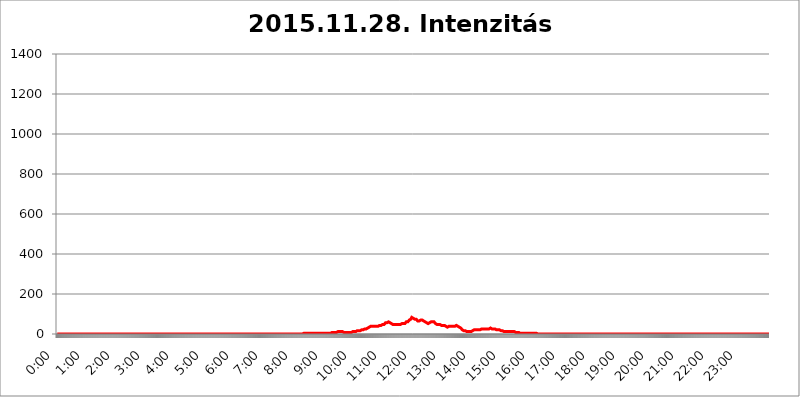
| Category | 2015.11.28. Intenzitás [W/m^2] |
|---|---|
| 0.0 | 0 |
| 0.0006944444444444445 | 0 |
| 0.001388888888888889 | 0 |
| 0.0020833333333333333 | 0 |
| 0.002777777777777778 | 0 |
| 0.003472222222222222 | 0 |
| 0.004166666666666667 | 0 |
| 0.004861111111111111 | 0 |
| 0.005555555555555556 | 0 |
| 0.0062499999999999995 | 0 |
| 0.006944444444444444 | 0 |
| 0.007638888888888889 | 0 |
| 0.008333333333333333 | 0 |
| 0.009027777777777779 | 0 |
| 0.009722222222222222 | 0 |
| 0.010416666666666666 | 0 |
| 0.011111111111111112 | 0 |
| 0.011805555555555555 | 0 |
| 0.012499999999999999 | 0 |
| 0.013194444444444444 | 0 |
| 0.013888888888888888 | 0 |
| 0.014583333333333332 | 0 |
| 0.015277777777777777 | 0 |
| 0.015972222222222224 | 0 |
| 0.016666666666666666 | 0 |
| 0.017361111111111112 | 0 |
| 0.018055555555555557 | 0 |
| 0.01875 | 0 |
| 0.019444444444444445 | 0 |
| 0.02013888888888889 | 0 |
| 0.020833333333333332 | 0 |
| 0.02152777777777778 | 0 |
| 0.022222222222222223 | 0 |
| 0.02291666666666667 | 0 |
| 0.02361111111111111 | 0 |
| 0.024305555555555556 | 0 |
| 0.024999999999999998 | 0 |
| 0.025694444444444447 | 0 |
| 0.02638888888888889 | 0 |
| 0.027083333333333334 | 0 |
| 0.027777777777777776 | 0 |
| 0.02847222222222222 | 0 |
| 0.029166666666666664 | 0 |
| 0.029861111111111113 | 0 |
| 0.030555555555555555 | 0 |
| 0.03125 | 0 |
| 0.03194444444444445 | 0 |
| 0.03263888888888889 | 0 |
| 0.03333333333333333 | 0 |
| 0.034027777777777775 | 0 |
| 0.034722222222222224 | 0 |
| 0.035416666666666666 | 0 |
| 0.036111111111111115 | 0 |
| 0.03680555555555556 | 0 |
| 0.0375 | 0 |
| 0.03819444444444444 | 0 |
| 0.03888888888888889 | 0 |
| 0.03958333333333333 | 0 |
| 0.04027777777777778 | 0 |
| 0.04097222222222222 | 0 |
| 0.041666666666666664 | 0 |
| 0.042361111111111106 | 0 |
| 0.04305555555555556 | 0 |
| 0.043750000000000004 | 0 |
| 0.044444444444444446 | 0 |
| 0.04513888888888889 | 0 |
| 0.04583333333333334 | 0 |
| 0.04652777777777778 | 0 |
| 0.04722222222222222 | 0 |
| 0.04791666666666666 | 0 |
| 0.04861111111111111 | 0 |
| 0.049305555555555554 | 0 |
| 0.049999999999999996 | 0 |
| 0.05069444444444445 | 0 |
| 0.051388888888888894 | 0 |
| 0.052083333333333336 | 0 |
| 0.05277777777777778 | 0 |
| 0.05347222222222222 | 0 |
| 0.05416666666666667 | 0 |
| 0.05486111111111111 | 0 |
| 0.05555555555555555 | 0 |
| 0.05625 | 0 |
| 0.05694444444444444 | 0 |
| 0.057638888888888885 | 0 |
| 0.05833333333333333 | 0 |
| 0.05902777777777778 | 0 |
| 0.059722222222222225 | 0 |
| 0.06041666666666667 | 0 |
| 0.061111111111111116 | 0 |
| 0.06180555555555556 | 0 |
| 0.0625 | 0 |
| 0.06319444444444444 | 0 |
| 0.06388888888888888 | 0 |
| 0.06458333333333334 | 0 |
| 0.06527777777777778 | 0 |
| 0.06597222222222222 | 0 |
| 0.06666666666666667 | 0 |
| 0.06736111111111111 | 0 |
| 0.06805555555555555 | 0 |
| 0.06874999999999999 | 0 |
| 0.06944444444444443 | 0 |
| 0.07013888888888889 | 0 |
| 0.07083333333333333 | 0 |
| 0.07152777777777779 | 0 |
| 0.07222222222222223 | 0 |
| 0.07291666666666667 | 0 |
| 0.07361111111111111 | 0 |
| 0.07430555555555556 | 0 |
| 0.075 | 0 |
| 0.07569444444444444 | 0 |
| 0.0763888888888889 | 0 |
| 0.07708333333333334 | 0 |
| 0.07777777777777778 | 0 |
| 0.07847222222222222 | 0 |
| 0.07916666666666666 | 0 |
| 0.0798611111111111 | 0 |
| 0.08055555555555556 | 0 |
| 0.08125 | 0 |
| 0.08194444444444444 | 0 |
| 0.08263888888888889 | 0 |
| 0.08333333333333333 | 0 |
| 0.08402777777777777 | 0 |
| 0.08472222222222221 | 0 |
| 0.08541666666666665 | 0 |
| 0.08611111111111112 | 0 |
| 0.08680555555555557 | 0 |
| 0.08750000000000001 | 0 |
| 0.08819444444444445 | 0 |
| 0.08888888888888889 | 0 |
| 0.08958333333333333 | 0 |
| 0.09027777777777778 | 0 |
| 0.09097222222222222 | 0 |
| 0.09166666666666667 | 0 |
| 0.09236111111111112 | 0 |
| 0.09305555555555556 | 0 |
| 0.09375 | 0 |
| 0.09444444444444444 | 0 |
| 0.09513888888888888 | 0 |
| 0.09583333333333333 | 0 |
| 0.09652777777777777 | 0 |
| 0.09722222222222222 | 0 |
| 0.09791666666666667 | 0 |
| 0.09861111111111111 | 0 |
| 0.09930555555555555 | 0 |
| 0.09999999999999999 | 0 |
| 0.10069444444444443 | 0 |
| 0.1013888888888889 | 0 |
| 0.10208333333333335 | 0 |
| 0.10277777777777779 | 0 |
| 0.10347222222222223 | 0 |
| 0.10416666666666667 | 0 |
| 0.10486111111111111 | 0 |
| 0.10555555555555556 | 0 |
| 0.10625 | 0 |
| 0.10694444444444444 | 0 |
| 0.1076388888888889 | 0 |
| 0.10833333333333334 | 0 |
| 0.10902777777777778 | 0 |
| 0.10972222222222222 | 0 |
| 0.1111111111111111 | 0 |
| 0.11180555555555556 | 0 |
| 0.11180555555555556 | 0 |
| 0.1125 | 0 |
| 0.11319444444444444 | 0 |
| 0.11388888888888889 | 0 |
| 0.11458333333333333 | 0 |
| 0.11527777777777777 | 0 |
| 0.11597222222222221 | 0 |
| 0.11666666666666665 | 0 |
| 0.1173611111111111 | 0 |
| 0.11805555555555557 | 0 |
| 0.11944444444444445 | 0 |
| 0.12013888888888889 | 0 |
| 0.12083333333333333 | 0 |
| 0.12152777777777778 | 0 |
| 0.12222222222222223 | 0 |
| 0.12291666666666667 | 0 |
| 0.12291666666666667 | 0 |
| 0.12361111111111112 | 0 |
| 0.12430555555555556 | 0 |
| 0.125 | 0 |
| 0.12569444444444444 | 0 |
| 0.12638888888888888 | 0 |
| 0.12708333333333333 | 0 |
| 0.16875 | 0 |
| 0.12847222222222224 | 0 |
| 0.12916666666666668 | 0 |
| 0.12986111111111112 | 0 |
| 0.13055555555555556 | 0 |
| 0.13125 | 0 |
| 0.13194444444444445 | 0 |
| 0.1326388888888889 | 0 |
| 0.13333333333333333 | 0 |
| 0.13402777777777777 | 0 |
| 0.13402777777777777 | 0 |
| 0.13472222222222222 | 0 |
| 0.13541666666666666 | 0 |
| 0.1361111111111111 | 0 |
| 0.13749999999999998 | 0 |
| 0.13819444444444443 | 0 |
| 0.1388888888888889 | 0 |
| 0.13958333333333334 | 0 |
| 0.14027777777777778 | 0 |
| 0.14097222222222222 | 0 |
| 0.14166666666666666 | 0 |
| 0.1423611111111111 | 0 |
| 0.14305555555555557 | 0 |
| 0.14375000000000002 | 0 |
| 0.14444444444444446 | 0 |
| 0.1451388888888889 | 0 |
| 0.1451388888888889 | 0 |
| 0.14652777777777778 | 0 |
| 0.14722222222222223 | 0 |
| 0.14791666666666667 | 0 |
| 0.1486111111111111 | 0 |
| 0.14930555555555555 | 0 |
| 0.15 | 0 |
| 0.15069444444444444 | 0 |
| 0.15138888888888888 | 0 |
| 0.15208333333333332 | 0 |
| 0.15277777777777776 | 0 |
| 0.15347222222222223 | 0 |
| 0.15416666666666667 | 0 |
| 0.15486111111111112 | 0 |
| 0.15555555555555556 | 0 |
| 0.15625 | 0 |
| 0.15694444444444444 | 0 |
| 0.15763888888888888 | 0 |
| 0.15833333333333333 | 0 |
| 0.15902777777777777 | 0 |
| 0.15972222222222224 | 0 |
| 0.16041666666666668 | 0 |
| 0.16111111111111112 | 0 |
| 0.16180555555555556 | 0 |
| 0.1625 | 0 |
| 0.16319444444444445 | 0 |
| 0.1638888888888889 | 0 |
| 0.16458333333333333 | 0 |
| 0.16527777777777777 | 0 |
| 0.16597222222222222 | 0 |
| 0.16666666666666666 | 0 |
| 0.1673611111111111 | 0 |
| 0.16805555555555554 | 0 |
| 0.16874999999999998 | 0 |
| 0.16944444444444443 | 0 |
| 0.17013888888888887 | 0 |
| 0.1708333333333333 | 0 |
| 0.17152777777777775 | 0 |
| 0.17222222222222225 | 0 |
| 0.1729166666666667 | 0 |
| 0.17361111111111113 | 0 |
| 0.17430555555555557 | 0 |
| 0.17500000000000002 | 0 |
| 0.17569444444444446 | 0 |
| 0.1763888888888889 | 0 |
| 0.17708333333333334 | 0 |
| 0.17777777777777778 | 0 |
| 0.17847222222222223 | 0 |
| 0.17916666666666667 | 0 |
| 0.1798611111111111 | 0 |
| 0.18055555555555555 | 0 |
| 0.18125 | 0 |
| 0.18194444444444444 | 0 |
| 0.1826388888888889 | 0 |
| 0.18333333333333335 | 0 |
| 0.1840277777777778 | 0 |
| 0.18472222222222223 | 0 |
| 0.18541666666666667 | 0 |
| 0.18611111111111112 | 0 |
| 0.18680555555555556 | 0 |
| 0.1875 | 0 |
| 0.18819444444444444 | 0 |
| 0.18888888888888888 | 0 |
| 0.18958333333333333 | 0 |
| 0.19027777777777777 | 0 |
| 0.1909722222222222 | 0 |
| 0.19166666666666665 | 0 |
| 0.19236111111111112 | 0 |
| 0.19305555555555554 | 0 |
| 0.19375 | 0 |
| 0.19444444444444445 | 0 |
| 0.1951388888888889 | 0 |
| 0.19583333333333333 | 0 |
| 0.19652777777777777 | 0 |
| 0.19722222222222222 | 0 |
| 0.19791666666666666 | 0 |
| 0.1986111111111111 | 0 |
| 0.19930555555555554 | 0 |
| 0.19999999999999998 | 0 |
| 0.20069444444444443 | 0 |
| 0.20138888888888887 | 0 |
| 0.2020833333333333 | 0 |
| 0.2027777777777778 | 0 |
| 0.2034722222222222 | 0 |
| 0.2041666666666667 | 0 |
| 0.20486111111111113 | 0 |
| 0.20555555555555557 | 0 |
| 0.20625000000000002 | 0 |
| 0.20694444444444446 | 0 |
| 0.2076388888888889 | 0 |
| 0.20833333333333334 | 0 |
| 0.20902777777777778 | 0 |
| 0.20972222222222223 | 0 |
| 0.21041666666666667 | 0 |
| 0.2111111111111111 | 0 |
| 0.21180555555555555 | 0 |
| 0.2125 | 0 |
| 0.21319444444444444 | 0 |
| 0.2138888888888889 | 0 |
| 0.21458333333333335 | 0 |
| 0.2152777777777778 | 0 |
| 0.21597222222222223 | 0 |
| 0.21666666666666667 | 0 |
| 0.21736111111111112 | 0 |
| 0.21805555555555556 | 0 |
| 0.21875 | 0 |
| 0.21944444444444444 | 0 |
| 0.22013888888888888 | 0 |
| 0.22083333333333333 | 0 |
| 0.22152777777777777 | 0 |
| 0.2222222222222222 | 0 |
| 0.22291666666666665 | 0 |
| 0.2236111111111111 | 0 |
| 0.22430555555555556 | 0 |
| 0.225 | 0 |
| 0.22569444444444445 | 0 |
| 0.2263888888888889 | 0 |
| 0.22708333333333333 | 0 |
| 0.22777777777777777 | 0 |
| 0.22847222222222222 | 0 |
| 0.22916666666666666 | 0 |
| 0.2298611111111111 | 0 |
| 0.23055555555555554 | 0 |
| 0.23124999999999998 | 0 |
| 0.23194444444444443 | 0 |
| 0.23263888888888887 | 0 |
| 0.2333333333333333 | 0 |
| 0.2340277777777778 | 0 |
| 0.2347222222222222 | 0 |
| 0.2354166666666667 | 0 |
| 0.23611111111111113 | 0 |
| 0.23680555555555557 | 0 |
| 0.23750000000000002 | 0 |
| 0.23819444444444446 | 0 |
| 0.2388888888888889 | 0 |
| 0.23958333333333334 | 0 |
| 0.24027777777777778 | 0 |
| 0.24097222222222223 | 0 |
| 0.24166666666666667 | 0 |
| 0.2423611111111111 | 0 |
| 0.24305555555555555 | 0 |
| 0.24375 | 0 |
| 0.24444444444444446 | 0 |
| 0.24513888888888888 | 0 |
| 0.24583333333333335 | 0 |
| 0.2465277777777778 | 0 |
| 0.24722222222222223 | 0 |
| 0.24791666666666667 | 0 |
| 0.24861111111111112 | 0 |
| 0.24930555555555556 | 0 |
| 0.25 | 0 |
| 0.25069444444444444 | 0 |
| 0.2513888888888889 | 0 |
| 0.2520833333333333 | 0 |
| 0.25277777777777777 | 0 |
| 0.2534722222222222 | 0 |
| 0.25416666666666665 | 0 |
| 0.2548611111111111 | 0 |
| 0.2555555555555556 | 0 |
| 0.25625000000000003 | 0 |
| 0.2569444444444445 | 0 |
| 0.2576388888888889 | 0 |
| 0.25833333333333336 | 0 |
| 0.2590277777777778 | 0 |
| 0.25972222222222224 | 0 |
| 0.2604166666666667 | 0 |
| 0.2611111111111111 | 0 |
| 0.26180555555555557 | 0 |
| 0.2625 | 0 |
| 0.26319444444444445 | 0 |
| 0.2638888888888889 | 0 |
| 0.26458333333333334 | 0 |
| 0.2652777777777778 | 0 |
| 0.2659722222222222 | 0 |
| 0.26666666666666666 | 0 |
| 0.2673611111111111 | 0 |
| 0.26805555555555555 | 0 |
| 0.26875 | 0 |
| 0.26944444444444443 | 0 |
| 0.2701388888888889 | 0 |
| 0.2708333333333333 | 0 |
| 0.27152777777777776 | 0 |
| 0.2722222222222222 | 0 |
| 0.27291666666666664 | 0 |
| 0.2736111111111111 | 0 |
| 0.2743055555555555 | 0 |
| 0.27499999999999997 | 0 |
| 0.27569444444444446 | 0 |
| 0.27638888888888885 | 0 |
| 0.27708333333333335 | 0 |
| 0.2777777777777778 | 0 |
| 0.27847222222222223 | 0 |
| 0.2791666666666667 | 0 |
| 0.2798611111111111 | 0 |
| 0.28055555555555556 | 0 |
| 0.28125 | 0 |
| 0.28194444444444444 | 0 |
| 0.2826388888888889 | 0 |
| 0.2833333333333333 | 0 |
| 0.28402777777777777 | 0 |
| 0.2847222222222222 | 0 |
| 0.28541666666666665 | 0 |
| 0.28611111111111115 | 0 |
| 0.28680555555555554 | 0 |
| 0.28750000000000003 | 0 |
| 0.2881944444444445 | 0 |
| 0.2888888888888889 | 0 |
| 0.28958333333333336 | 0 |
| 0.2902777777777778 | 0 |
| 0.29097222222222224 | 0 |
| 0.2916666666666667 | 0 |
| 0.2923611111111111 | 0 |
| 0.29305555555555557 | 0 |
| 0.29375 | 0 |
| 0.29444444444444445 | 0 |
| 0.2951388888888889 | 0 |
| 0.29583333333333334 | 0 |
| 0.2965277777777778 | 0 |
| 0.2972222222222222 | 0 |
| 0.29791666666666666 | 0 |
| 0.2986111111111111 | 0 |
| 0.29930555555555555 | 0 |
| 0.3 | 0 |
| 0.30069444444444443 | 0 |
| 0.3013888888888889 | 0 |
| 0.3020833333333333 | 0 |
| 0.30277777777777776 | 0 |
| 0.3034722222222222 | 0 |
| 0.30416666666666664 | 0 |
| 0.3048611111111111 | 0 |
| 0.3055555555555555 | 0 |
| 0.30624999999999997 | 0 |
| 0.3069444444444444 | 0 |
| 0.3076388888888889 | 0 |
| 0.30833333333333335 | 0 |
| 0.3090277777777778 | 0 |
| 0.30972222222222223 | 0 |
| 0.3104166666666667 | 0 |
| 0.3111111111111111 | 0 |
| 0.31180555555555556 | 0 |
| 0.3125 | 0 |
| 0.31319444444444444 | 0 |
| 0.3138888888888889 | 0 |
| 0.3145833333333333 | 0 |
| 0.31527777777777777 | 0 |
| 0.3159722222222222 | 0 |
| 0.31666666666666665 | 0 |
| 0.31736111111111115 | 0 |
| 0.31805555555555554 | 0 |
| 0.31875000000000003 | 0 |
| 0.3194444444444445 | 0 |
| 0.3201388888888889 | 0 |
| 0.32083333333333336 | 0 |
| 0.3215277777777778 | 0 |
| 0.32222222222222224 | 0 |
| 0.3229166666666667 | 0 |
| 0.3236111111111111 | 0 |
| 0.32430555555555557 | 0 |
| 0.325 | 0 |
| 0.32569444444444445 | 0 |
| 0.3263888888888889 | 0 |
| 0.32708333333333334 | 0 |
| 0.3277777777777778 | 0 |
| 0.3284722222222222 | 0 |
| 0.32916666666666666 | 0 |
| 0.3298611111111111 | 0 |
| 0.33055555555555555 | 0 |
| 0.33125 | 0 |
| 0.33194444444444443 | 0 |
| 0.3326388888888889 | 0 |
| 0.3333333333333333 | 0 |
| 0.3340277777777778 | 0 |
| 0.3347222222222222 | 0 |
| 0.3354166666666667 | 0 |
| 0.3361111111111111 | 0 |
| 0.3368055555555556 | 0 |
| 0.33749999999999997 | 0 |
| 0.33819444444444446 | 0 |
| 0.33888888888888885 | 0 |
| 0.33958333333333335 | 0 |
| 0.34027777777777773 | 0 |
| 0.34097222222222223 | 0 |
| 0.3416666666666666 | 0 |
| 0.3423611111111111 | 0 |
| 0.3430555555555555 | 0 |
| 0.34375 | 0 |
| 0.3444444444444445 | 0 |
| 0.3451388888888889 | 3.525 |
| 0.3458333333333334 | 3.525 |
| 0.34652777777777777 | 3.525 |
| 0.34722222222222227 | 3.525 |
| 0.34791666666666665 | 3.525 |
| 0.34861111111111115 | 3.525 |
| 0.34930555555555554 | 3.525 |
| 0.35000000000000003 | 3.525 |
| 0.3506944444444444 | 3.525 |
| 0.3513888888888889 | 3.525 |
| 0.3520833333333333 | 3.525 |
| 0.3527777777777778 | 3.525 |
| 0.3534722222222222 | 3.525 |
| 0.3541666666666667 | 3.525 |
| 0.3548611111111111 | 3.525 |
| 0.35555555555555557 | 3.525 |
| 0.35625 | 3.525 |
| 0.35694444444444445 | 3.525 |
| 0.3576388888888889 | 3.525 |
| 0.35833333333333334 | 3.525 |
| 0.3590277777777778 | 3.525 |
| 0.3597222222222222 | 3.525 |
| 0.36041666666666666 | 3.525 |
| 0.3611111111111111 | 3.525 |
| 0.36180555555555555 | 3.525 |
| 0.3625 | 3.525 |
| 0.36319444444444443 | 3.525 |
| 0.3638888888888889 | 3.525 |
| 0.3645833333333333 | 3.525 |
| 0.3652777777777778 | 3.525 |
| 0.3659722222222222 | 3.525 |
| 0.3666666666666667 | 3.525 |
| 0.3673611111111111 | 3.525 |
| 0.3680555555555556 | 3.525 |
| 0.36874999999999997 | 3.525 |
| 0.36944444444444446 | 3.525 |
| 0.37013888888888885 | 3.525 |
| 0.37083333333333335 | 3.525 |
| 0.37152777777777773 | 3.525 |
| 0.37222222222222223 | 3.525 |
| 0.3729166666666666 | 3.525 |
| 0.3736111111111111 | 3.525 |
| 0.3743055555555555 | 3.525 |
| 0.375 | 3.525 |
| 0.3756944444444445 | 3.525 |
| 0.3763888888888889 | 3.525 |
| 0.3770833333333334 | 3.525 |
| 0.37777777777777777 | 3.525 |
| 0.37847222222222227 | 3.525 |
| 0.37916666666666665 | 3.525 |
| 0.37986111111111115 | 3.525 |
| 0.38055555555555554 | 3.525 |
| 0.38125000000000003 | 3.525 |
| 0.3819444444444444 | 3.525 |
| 0.3826388888888889 | 3.525 |
| 0.3833333333333333 | 3.525 |
| 0.3840277777777778 | 3.525 |
| 0.3847222222222222 | 3.525 |
| 0.3854166666666667 | 7.887 |
| 0.3861111111111111 | 7.887 |
| 0.38680555555555557 | 7.887 |
| 0.3875 | 7.887 |
| 0.38819444444444445 | 7.887 |
| 0.3888888888888889 | 7.887 |
| 0.38958333333333334 | 7.887 |
| 0.3902777777777778 | 7.887 |
| 0.3909722222222222 | 7.887 |
| 0.39166666666666666 | 7.887 |
| 0.3923611111111111 | 12.257 |
| 0.39305555555555555 | 12.257 |
| 0.39375 | 12.257 |
| 0.39444444444444443 | 12.257 |
| 0.3951388888888889 | 12.257 |
| 0.3958333333333333 | 12.257 |
| 0.3965277777777778 | 12.257 |
| 0.3972222222222222 | 12.257 |
| 0.3979166666666667 | 12.257 |
| 0.3986111111111111 | 12.257 |
| 0.3993055555555556 | 12.257 |
| 0.39999999999999997 | 12.257 |
| 0.40069444444444446 | 12.257 |
| 0.40138888888888885 | 12.257 |
| 0.40208333333333335 | 7.887 |
| 0.40277777777777773 | 7.887 |
| 0.40347222222222223 | 7.887 |
| 0.4041666666666666 | 7.887 |
| 0.4048611111111111 | 7.887 |
| 0.4055555555555555 | 7.887 |
| 0.40625 | 7.887 |
| 0.4069444444444445 | 7.887 |
| 0.4076388888888889 | 7.887 |
| 0.4083333333333334 | 7.887 |
| 0.40902777777777777 | 7.887 |
| 0.40972222222222227 | 7.887 |
| 0.41041666666666665 | 7.887 |
| 0.41111111111111115 | 7.887 |
| 0.41180555555555554 | 7.887 |
| 0.41250000000000003 | 7.887 |
| 0.4131944444444444 | 12.257 |
| 0.4138888888888889 | 12.257 |
| 0.4145833333333333 | 12.257 |
| 0.4152777777777778 | 12.257 |
| 0.4159722222222222 | 12.257 |
| 0.4166666666666667 | 12.257 |
| 0.4173611111111111 | 12.257 |
| 0.41805555555555557 | 12.257 |
| 0.41875 | 12.257 |
| 0.41944444444444445 | 12.257 |
| 0.4201388888888889 | 12.257 |
| 0.42083333333333334 | 16.636 |
| 0.4215277777777778 | 16.636 |
| 0.4222222222222222 | 16.636 |
| 0.42291666666666666 | 16.636 |
| 0.4236111111111111 | 16.636 |
| 0.42430555555555555 | 16.636 |
| 0.425 | 16.636 |
| 0.42569444444444443 | 21.024 |
| 0.4263888888888889 | 21.024 |
| 0.4270833333333333 | 21.024 |
| 0.4277777777777778 | 21.024 |
| 0.4284722222222222 | 21.024 |
| 0.4291666666666667 | 21.024 |
| 0.4298611111111111 | 21.024 |
| 0.4305555555555556 | 21.024 |
| 0.43124999999999997 | 25.419 |
| 0.43194444444444446 | 25.419 |
| 0.43263888888888885 | 25.419 |
| 0.43333333333333335 | 25.419 |
| 0.43402777777777773 | 25.419 |
| 0.43472222222222223 | 29.823 |
| 0.4354166666666666 | 29.823 |
| 0.4361111111111111 | 29.823 |
| 0.4368055555555555 | 29.823 |
| 0.4375 | 34.234 |
| 0.4381944444444445 | 38.653 |
| 0.4388888888888889 | 38.653 |
| 0.4395833333333334 | 38.653 |
| 0.44027777777777777 | 38.653 |
| 0.44097222222222227 | 38.653 |
| 0.44166666666666665 | 38.653 |
| 0.44236111111111115 | 38.653 |
| 0.44305555555555554 | 38.653 |
| 0.44375000000000003 | 38.653 |
| 0.4444444444444444 | 38.653 |
| 0.4451388888888889 | 38.653 |
| 0.4458333333333333 | 38.653 |
| 0.4465277777777778 | 38.653 |
| 0.4472222222222222 | 38.653 |
| 0.4479166666666667 | 38.653 |
| 0.4486111111111111 | 38.653 |
| 0.44930555555555557 | 38.653 |
| 0.45 | 38.653 |
| 0.45069444444444445 | 43.079 |
| 0.4513888888888889 | 43.079 |
| 0.45208333333333334 | 43.079 |
| 0.4527777777777778 | 43.079 |
| 0.4534722222222222 | 43.079 |
| 0.45416666666666666 | 43.079 |
| 0.4548611111111111 | 47.511 |
| 0.45555555555555555 | 47.511 |
| 0.45625 | 47.511 |
| 0.45694444444444443 | 47.511 |
| 0.4576388888888889 | 47.511 |
| 0.4583333333333333 | 47.511 |
| 0.4590277777777778 | 51.951 |
| 0.4597222222222222 | 51.951 |
| 0.4604166666666667 | 56.398 |
| 0.4611111111111111 | 56.398 |
| 0.4618055555555556 | 56.398 |
| 0.46249999999999997 | 56.398 |
| 0.46319444444444446 | 60.85 |
| 0.46388888888888885 | 60.85 |
| 0.46458333333333335 | 60.85 |
| 0.46527777777777773 | 60.85 |
| 0.46597222222222223 | 56.398 |
| 0.4666666666666666 | 56.398 |
| 0.4673611111111111 | 51.951 |
| 0.4680555555555555 | 51.951 |
| 0.46875 | 51.951 |
| 0.4694444444444445 | 51.951 |
| 0.4701388888888889 | 51.951 |
| 0.4708333333333334 | 47.511 |
| 0.47152777777777777 | 47.511 |
| 0.47222222222222227 | 47.511 |
| 0.47291666666666665 | 47.511 |
| 0.47361111111111115 | 47.511 |
| 0.47430555555555554 | 47.511 |
| 0.47500000000000003 | 47.511 |
| 0.4756944444444444 | 47.511 |
| 0.4763888888888889 | 47.511 |
| 0.4770833333333333 | 47.511 |
| 0.4777777777777778 | 47.511 |
| 0.4784722222222222 | 47.511 |
| 0.4791666666666667 | 47.511 |
| 0.4798611111111111 | 47.511 |
| 0.48055555555555557 | 47.511 |
| 0.48125 | 47.511 |
| 0.48194444444444445 | 47.511 |
| 0.4826388888888889 | 51.951 |
| 0.48333333333333334 | 51.951 |
| 0.4840277777777778 | 51.951 |
| 0.4847222222222222 | 51.951 |
| 0.48541666666666666 | 51.951 |
| 0.4861111111111111 | 51.951 |
| 0.48680555555555555 | 51.951 |
| 0.4875 | 51.951 |
| 0.48819444444444443 | 56.398 |
| 0.4888888888888889 | 56.398 |
| 0.4895833333333333 | 60.85 |
| 0.4902777777777778 | 60.85 |
| 0.4909722222222222 | 60.85 |
| 0.4916666666666667 | 60.85 |
| 0.4923611111111111 | 65.31 |
| 0.4930555555555556 | 65.31 |
| 0.49374999999999997 | 69.775 |
| 0.49444444444444446 | 69.775 |
| 0.49513888888888885 | 74.246 |
| 0.49583333333333335 | 74.246 |
| 0.49652777777777773 | 78.722 |
| 0.49722222222222223 | 83.205 |
| 0.4979166666666666 | 83.205 |
| 0.4986111111111111 | 83.205 |
| 0.4993055555555555 | 78.722 |
| 0.5 | 78.722 |
| 0.5006944444444444 | 74.246 |
| 0.5013888888888889 | 74.246 |
| 0.5020833333333333 | 74.246 |
| 0.5027777777777778 | 74.246 |
| 0.5034722222222222 | 74.246 |
| 0.5041666666666667 | 69.775 |
| 0.5048611111111111 | 69.775 |
| 0.5055555555555555 | 65.31 |
| 0.50625 | 65.31 |
| 0.5069444444444444 | 65.31 |
| 0.5076388888888889 | 65.31 |
| 0.5083333333333333 | 65.31 |
| 0.5090277777777777 | 65.31 |
| 0.5097222222222222 | 69.775 |
| 0.5104166666666666 | 65.31 |
| 0.5111111111111112 | 65.31 |
| 0.5118055555555555 | 69.775 |
| 0.5125000000000001 | 65.31 |
| 0.5131944444444444 | 65.31 |
| 0.513888888888889 | 65.31 |
| 0.5145833333333333 | 65.31 |
| 0.5152777777777778 | 60.85 |
| 0.5159722222222222 | 60.85 |
| 0.5166666666666667 | 60.85 |
| 0.517361111111111 | 56.398 |
| 0.5180555555555556 | 56.398 |
| 0.5187499999999999 | 51.951 |
| 0.5194444444444445 | 51.951 |
| 0.5201388888888888 | 51.951 |
| 0.5208333333333334 | 56.398 |
| 0.5215277777777778 | 56.398 |
| 0.5222222222222223 | 56.398 |
| 0.5229166666666667 | 56.398 |
| 0.5236111111111111 | 60.85 |
| 0.5243055555555556 | 60.85 |
| 0.525 | 60.85 |
| 0.5256944444444445 | 60.85 |
| 0.5263888888888889 | 60.85 |
| 0.5270833333333333 | 60.85 |
| 0.5277777777777778 | 60.85 |
| 0.5284722222222222 | 60.85 |
| 0.5291666666666667 | 56.398 |
| 0.5298611111111111 | 56.398 |
| 0.5305555555555556 | 51.951 |
| 0.53125 | 51.951 |
| 0.5319444444444444 | 47.511 |
| 0.5326388888888889 | 47.511 |
| 0.5333333333333333 | 47.511 |
| 0.5340277777777778 | 47.511 |
| 0.5347222222222222 | 47.511 |
| 0.5354166666666667 | 47.511 |
| 0.5361111111111111 | 47.511 |
| 0.5368055555555555 | 47.511 |
| 0.5375 | 47.511 |
| 0.5381944444444444 | 47.511 |
| 0.5388888888888889 | 43.079 |
| 0.5395833333333333 | 43.079 |
| 0.5402777777777777 | 43.079 |
| 0.5409722222222222 | 43.079 |
| 0.5416666666666666 | 43.079 |
| 0.5423611111111112 | 43.079 |
| 0.5430555555555555 | 43.079 |
| 0.5437500000000001 | 38.653 |
| 0.5444444444444444 | 38.653 |
| 0.545138888888889 | 38.653 |
| 0.5458333333333333 | 34.234 |
| 0.5465277777777778 | 34.234 |
| 0.5472222222222222 | 34.234 |
| 0.5479166666666667 | 38.653 |
| 0.548611111111111 | 38.653 |
| 0.5493055555555556 | 38.653 |
| 0.5499999999999999 | 38.653 |
| 0.5506944444444445 | 38.653 |
| 0.5513888888888888 | 38.653 |
| 0.5520833333333334 | 38.653 |
| 0.5527777777777778 | 38.653 |
| 0.5534722222222223 | 38.653 |
| 0.5541666666666667 | 38.653 |
| 0.5548611111111111 | 38.653 |
| 0.5555555555555556 | 38.653 |
| 0.55625 | 38.653 |
| 0.5569444444444445 | 38.653 |
| 0.5576388888888889 | 38.653 |
| 0.5583333333333333 | 38.653 |
| 0.5590277777777778 | 38.653 |
| 0.5597222222222222 | 43.079 |
| 0.5604166666666667 | 43.079 |
| 0.5611111111111111 | 43.079 |
| 0.5618055555555556 | 38.653 |
| 0.5625 | 38.653 |
| 0.5631944444444444 | 38.653 |
| 0.5638888888888889 | 34.234 |
| 0.5645833333333333 | 34.234 |
| 0.5652777777777778 | 29.823 |
| 0.5659722222222222 | 29.823 |
| 0.5666666666666667 | 29.823 |
| 0.5673611111111111 | 25.419 |
| 0.5680555555555555 | 21.024 |
| 0.56875 | 21.024 |
| 0.5694444444444444 | 21.024 |
| 0.5701388888888889 | 16.636 |
| 0.5708333333333333 | 16.636 |
| 0.5715277777777777 | 16.636 |
| 0.5722222222222222 | 16.636 |
| 0.5729166666666666 | 12.257 |
| 0.5736111111111112 | 16.636 |
| 0.5743055555555555 | 12.257 |
| 0.5750000000000001 | 12.257 |
| 0.5756944444444444 | 12.257 |
| 0.576388888888889 | 12.257 |
| 0.5770833333333333 | 12.257 |
| 0.5777777777777778 | 12.257 |
| 0.5784722222222222 | 12.257 |
| 0.5791666666666667 | 12.257 |
| 0.579861111111111 | 12.257 |
| 0.5805555555555556 | 12.257 |
| 0.5812499999999999 | 16.636 |
| 0.5819444444444445 | 16.636 |
| 0.5826388888888888 | 16.636 |
| 0.5833333333333334 | 16.636 |
| 0.5840277777777778 | 21.024 |
| 0.5847222222222223 | 21.024 |
| 0.5854166666666667 | 21.024 |
| 0.5861111111111111 | 21.024 |
| 0.5868055555555556 | 21.024 |
| 0.5875 | 21.024 |
| 0.5881944444444445 | 21.024 |
| 0.5888888888888889 | 21.024 |
| 0.5895833333333333 | 21.024 |
| 0.5902777777777778 | 21.024 |
| 0.5909722222222222 | 21.024 |
| 0.5916666666666667 | 21.024 |
| 0.5923611111111111 | 21.024 |
| 0.5930555555555556 | 21.024 |
| 0.59375 | 21.024 |
| 0.5944444444444444 | 25.419 |
| 0.5951388888888889 | 25.419 |
| 0.5958333333333333 | 25.419 |
| 0.5965277777777778 | 25.419 |
| 0.5972222222222222 | 25.419 |
| 0.5979166666666667 | 25.419 |
| 0.5986111111111111 | 25.419 |
| 0.5993055555555555 | 25.419 |
| 0.6 | 25.419 |
| 0.6006944444444444 | 25.419 |
| 0.6013888888888889 | 25.419 |
| 0.6020833333333333 | 25.419 |
| 0.6027777777777777 | 25.419 |
| 0.6034722222222222 | 25.419 |
| 0.6041666666666666 | 25.419 |
| 0.6048611111111112 | 29.823 |
| 0.6055555555555555 | 25.419 |
| 0.6062500000000001 | 29.823 |
| 0.6069444444444444 | 29.823 |
| 0.607638888888889 | 29.823 |
| 0.6083333333333333 | 29.823 |
| 0.6090277777777778 | 25.419 |
| 0.6097222222222222 | 25.419 |
| 0.6104166666666667 | 25.419 |
| 0.611111111111111 | 25.419 |
| 0.6118055555555556 | 25.419 |
| 0.6124999999999999 | 25.419 |
| 0.6131944444444445 | 25.419 |
| 0.6138888888888888 | 25.419 |
| 0.6145833333333334 | 25.419 |
| 0.6152777777777778 | 25.419 |
| 0.6159722222222223 | 21.024 |
| 0.6166666666666667 | 21.024 |
| 0.6173611111111111 | 21.024 |
| 0.6180555555555556 | 21.024 |
| 0.61875 | 21.024 |
| 0.6194444444444445 | 21.024 |
| 0.6201388888888889 | 21.024 |
| 0.6208333333333333 | 21.024 |
| 0.6215277777777778 | 16.636 |
| 0.6222222222222222 | 16.636 |
| 0.6229166666666667 | 16.636 |
| 0.6236111111111111 | 16.636 |
| 0.6243055555555556 | 16.636 |
| 0.625 | 12.257 |
| 0.6256944444444444 | 12.257 |
| 0.6263888888888889 | 12.257 |
| 0.6270833333333333 | 12.257 |
| 0.6277777777777778 | 12.257 |
| 0.6284722222222222 | 12.257 |
| 0.6291666666666667 | 12.257 |
| 0.6298611111111111 | 12.257 |
| 0.6305555555555555 | 12.257 |
| 0.63125 | 12.257 |
| 0.6319444444444444 | 12.257 |
| 0.6326388888888889 | 12.257 |
| 0.6333333333333333 | 12.257 |
| 0.6340277777777777 | 12.257 |
| 0.6347222222222222 | 12.257 |
| 0.6354166666666666 | 12.257 |
| 0.6361111111111112 | 12.257 |
| 0.6368055555555555 | 12.257 |
| 0.6375000000000001 | 12.257 |
| 0.6381944444444444 | 12.257 |
| 0.638888888888889 | 12.257 |
| 0.6395833333333333 | 12.257 |
| 0.6402777777777778 | 12.257 |
| 0.6409722222222222 | 12.257 |
| 0.6416666666666667 | 12.257 |
| 0.642361111111111 | 12.257 |
| 0.6430555555555556 | 7.887 |
| 0.6437499999999999 | 7.887 |
| 0.6444444444444445 | 7.887 |
| 0.6451388888888888 | 7.887 |
| 0.6458333333333334 | 7.887 |
| 0.6465277777777778 | 7.887 |
| 0.6472222222222223 | 7.887 |
| 0.6479166666666667 | 7.887 |
| 0.6486111111111111 | 3.525 |
| 0.6493055555555556 | 3.525 |
| 0.65 | 3.525 |
| 0.6506944444444445 | 3.525 |
| 0.6513888888888889 | 3.525 |
| 0.6520833333333333 | 3.525 |
| 0.6527777777777778 | 3.525 |
| 0.6534722222222222 | 3.525 |
| 0.6541666666666667 | 3.525 |
| 0.6548611111111111 | 3.525 |
| 0.6555555555555556 | 3.525 |
| 0.65625 | 3.525 |
| 0.6569444444444444 | 3.525 |
| 0.6576388888888889 | 3.525 |
| 0.6583333333333333 | 3.525 |
| 0.6590277777777778 | 3.525 |
| 0.6597222222222222 | 3.525 |
| 0.6604166666666667 | 3.525 |
| 0.6611111111111111 | 3.525 |
| 0.6618055555555555 | 3.525 |
| 0.6625 | 3.525 |
| 0.6631944444444444 | 3.525 |
| 0.6638888888888889 | 3.525 |
| 0.6645833333333333 | 3.525 |
| 0.6652777777777777 | 3.525 |
| 0.6659722222222222 | 3.525 |
| 0.6666666666666666 | 3.525 |
| 0.6673611111111111 | 3.525 |
| 0.6680555555555556 | 3.525 |
| 0.6687500000000001 | 3.525 |
| 0.6694444444444444 | 3.525 |
| 0.6701388888888888 | 3.525 |
| 0.6708333333333334 | 3.525 |
| 0.6715277777777778 | 3.525 |
| 0.6722222222222222 | 3.525 |
| 0.6729166666666666 | 3.525 |
| 0.6736111111111112 | 0 |
| 0.6743055555555556 | 0 |
| 0.6749999999999999 | 0 |
| 0.6756944444444444 | 0 |
| 0.6763888888888889 | 0 |
| 0.6770833333333334 | 0 |
| 0.6777777777777777 | 0 |
| 0.6784722222222223 | 0 |
| 0.6791666666666667 | 0 |
| 0.6798611111111111 | 0 |
| 0.6805555555555555 | 0 |
| 0.68125 | 0 |
| 0.6819444444444445 | 0 |
| 0.6826388888888889 | 0 |
| 0.6833333333333332 | 0 |
| 0.6840277777777778 | 0 |
| 0.6847222222222222 | 0 |
| 0.6854166666666667 | 0 |
| 0.686111111111111 | 0 |
| 0.6868055555555556 | 0 |
| 0.6875 | 0 |
| 0.6881944444444444 | 0 |
| 0.688888888888889 | 0 |
| 0.6895833333333333 | 0 |
| 0.6902777777777778 | 0 |
| 0.6909722222222222 | 0 |
| 0.6916666666666668 | 0 |
| 0.6923611111111111 | 0 |
| 0.6930555555555555 | 0 |
| 0.69375 | 0 |
| 0.6944444444444445 | 0 |
| 0.6951388888888889 | 0 |
| 0.6958333333333333 | 0 |
| 0.6965277777777777 | 0 |
| 0.6972222222222223 | 0 |
| 0.6979166666666666 | 0 |
| 0.6986111111111111 | 0 |
| 0.6993055555555556 | 0 |
| 0.7000000000000001 | 0 |
| 0.7006944444444444 | 0 |
| 0.7013888888888888 | 0 |
| 0.7020833333333334 | 0 |
| 0.7027777777777778 | 0 |
| 0.7034722222222222 | 0 |
| 0.7041666666666666 | 0 |
| 0.7048611111111112 | 0 |
| 0.7055555555555556 | 0 |
| 0.7062499999999999 | 0 |
| 0.7069444444444444 | 0 |
| 0.7076388888888889 | 0 |
| 0.7083333333333334 | 0 |
| 0.7090277777777777 | 0 |
| 0.7097222222222223 | 0 |
| 0.7104166666666667 | 0 |
| 0.7111111111111111 | 0 |
| 0.7118055555555555 | 0 |
| 0.7125 | 0 |
| 0.7131944444444445 | 0 |
| 0.7138888888888889 | 0 |
| 0.7145833333333332 | 0 |
| 0.7152777777777778 | 0 |
| 0.7159722222222222 | 0 |
| 0.7166666666666667 | 0 |
| 0.717361111111111 | 0 |
| 0.7180555555555556 | 0 |
| 0.71875 | 0 |
| 0.7194444444444444 | 0 |
| 0.720138888888889 | 0 |
| 0.7208333333333333 | 0 |
| 0.7215277777777778 | 0 |
| 0.7222222222222222 | 0 |
| 0.7229166666666668 | 0 |
| 0.7236111111111111 | 0 |
| 0.7243055555555555 | 0 |
| 0.725 | 0 |
| 0.7256944444444445 | 0 |
| 0.7263888888888889 | 0 |
| 0.7270833333333333 | 0 |
| 0.7277777777777777 | 0 |
| 0.7284722222222223 | 0 |
| 0.7291666666666666 | 0 |
| 0.7298611111111111 | 0 |
| 0.7305555555555556 | 0 |
| 0.7312500000000001 | 0 |
| 0.7319444444444444 | 0 |
| 0.7326388888888888 | 0 |
| 0.7333333333333334 | 0 |
| 0.7340277777777778 | 0 |
| 0.7347222222222222 | 0 |
| 0.7354166666666666 | 0 |
| 0.7361111111111112 | 0 |
| 0.7368055555555556 | 0 |
| 0.7374999999999999 | 0 |
| 0.7381944444444444 | 0 |
| 0.7388888888888889 | 0 |
| 0.7395833333333334 | 0 |
| 0.7402777777777777 | 0 |
| 0.7409722222222223 | 0 |
| 0.7416666666666667 | 0 |
| 0.7423611111111111 | 0 |
| 0.7430555555555555 | 0 |
| 0.74375 | 0 |
| 0.7444444444444445 | 0 |
| 0.7451388888888889 | 0 |
| 0.7458333333333332 | 0 |
| 0.7465277777777778 | 0 |
| 0.7472222222222222 | 0 |
| 0.7479166666666667 | 0 |
| 0.748611111111111 | 0 |
| 0.7493055555555556 | 0 |
| 0.75 | 0 |
| 0.7506944444444444 | 0 |
| 0.751388888888889 | 0 |
| 0.7520833333333333 | 0 |
| 0.7527777777777778 | 0 |
| 0.7534722222222222 | 0 |
| 0.7541666666666668 | 0 |
| 0.7548611111111111 | 0 |
| 0.7555555555555555 | 0 |
| 0.75625 | 0 |
| 0.7569444444444445 | 0 |
| 0.7576388888888889 | 0 |
| 0.7583333333333333 | 0 |
| 0.7590277777777777 | 0 |
| 0.7597222222222223 | 0 |
| 0.7604166666666666 | 0 |
| 0.7611111111111111 | 0 |
| 0.7618055555555556 | 0 |
| 0.7625000000000001 | 0 |
| 0.7631944444444444 | 0 |
| 0.7638888888888888 | 0 |
| 0.7645833333333334 | 0 |
| 0.7652777777777778 | 0 |
| 0.7659722222222222 | 0 |
| 0.7666666666666666 | 0 |
| 0.7673611111111112 | 0 |
| 0.7680555555555556 | 0 |
| 0.7687499999999999 | 0 |
| 0.7694444444444444 | 0 |
| 0.7701388888888889 | 0 |
| 0.7708333333333334 | 0 |
| 0.7715277777777777 | 0 |
| 0.7722222222222223 | 0 |
| 0.7729166666666667 | 0 |
| 0.7736111111111111 | 0 |
| 0.7743055555555555 | 0 |
| 0.775 | 0 |
| 0.7756944444444445 | 0 |
| 0.7763888888888889 | 0 |
| 0.7770833333333332 | 0 |
| 0.7777777777777778 | 0 |
| 0.7784722222222222 | 0 |
| 0.7791666666666667 | 0 |
| 0.779861111111111 | 0 |
| 0.7805555555555556 | 0 |
| 0.78125 | 0 |
| 0.7819444444444444 | 0 |
| 0.782638888888889 | 0 |
| 0.7833333333333333 | 0 |
| 0.7840277777777778 | 0 |
| 0.7847222222222222 | 0 |
| 0.7854166666666668 | 0 |
| 0.7861111111111111 | 0 |
| 0.7868055555555555 | 0 |
| 0.7875 | 0 |
| 0.7881944444444445 | 0 |
| 0.7888888888888889 | 0 |
| 0.7895833333333333 | 0 |
| 0.7902777777777777 | 0 |
| 0.7909722222222223 | 0 |
| 0.7916666666666666 | 0 |
| 0.7923611111111111 | 0 |
| 0.7930555555555556 | 0 |
| 0.7937500000000001 | 0 |
| 0.7944444444444444 | 0 |
| 0.7951388888888888 | 0 |
| 0.7958333333333334 | 0 |
| 0.7965277777777778 | 0 |
| 0.7972222222222222 | 0 |
| 0.7979166666666666 | 0 |
| 0.7986111111111112 | 0 |
| 0.7993055555555556 | 0 |
| 0.7999999999999999 | 0 |
| 0.8006944444444444 | 0 |
| 0.8013888888888889 | 0 |
| 0.8020833333333334 | 0 |
| 0.8027777777777777 | 0 |
| 0.8034722222222223 | 0 |
| 0.8041666666666667 | 0 |
| 0.8048611111111111 | 0 |
| 0.8055555555555555 | 0 |
| 0.80625 | 0 |
| 0.8069444444444445 | 0 |
| 0.8076388888888889 | 0 |
| 0.8083333333333332 | 0 |
| 0.8090277777777778 | 0 |
| 0.8097222222222222 | 0 |
| 0.8104166666666667 | 0 |
| 0.811111111111111 | 0 |
| 0.8118055555555556 | 0 |
| 0.8125 | 0 |
| 0.8131944444444444 | 0 |
| 0.813888888888889 | 0 |
| 0.8145833333333333 | 0 |
| 0.8152777777777778 | 0 |
| 0.8159722222222222 | 0 |
| 0.8166666666666668 | 0 |
| 0.8173611111111111 | 0 |
| 0.8180555555555555 | 0 |
| 0.81875 | 0 |
| 0.8194444444444445 | 0 |
| 0.8201388888888889 | 0 |
| 0.8208333333333333 | 0 |
| 0.8215277777777777 | 0 |
| 0.8222222222222223 | 0 |
| 0.8229166666666666 | 0 |
| 0.8236111111111111 | 0 |
| 0.8243055555555556 | 0 |
| 0.8250000000000001 | 0 |
| 0.8256944444444444 | 0 |
| 0.8263888888888888 | 0 |
| 0.8270833333333334 | 0 |
| 0.8277777777777778 | 0 |
| 0.8284722222222222 | 0 |
| 0.8291666666666666 | 0 |
| 0.8298611111111112 | 0 |
| 0.8305555555555556 | 0 |
| 0.8312499999999999 | 0 |
| 0.8319444444444444 | 0 |
| 0.8326388888888889 | 0 |
| 0.8333333333333334 | 0 |
| 0.8340277777777777 | 0 |
| 0.8347222222222223 | 0 |
| 0.8354166666666667 | 0 |
| 0.8361111111111111 | 0 |
| 0.8368055555555555 | 0 |
| 0.8375 | 0 |
| 0.8381944444444445 | 0 |
| 0.8388888888888889 | 0 |
| 0.8395833333333332 | 0 |
| 0.8402777777777778 | 0 |
| 0.8409722222222222 | 0 |
| 0.8416666666666667 | 0 |
| 0.842361111111111 | 0 |
| 0.8430555555555556 | 0 |
| 0.84375 | 0 |
| 0.8444444444444444 | 0 |
| 0.845138888888889 | 0 |
| 0.8458333333333333 | 0 |
| 0.8465277777777778 | 0 |
| 0.8472222222222222 | 0 |
| 0.8479166666666668 | 0 |
| 0.8486111111111111 | 0 |
| 0.8493055555555555 | 0 |
| 0.85 | 0 |
| 0.8506944444444445 | 0 |
| 0.8513888888888889 | 0 |
| 0.8520833333333333 | 0 |
| 0.8527777777777777 | 0 |
| 0.8534722222222223 | 0 |
| 0.8541666666666666 | 0 |
| 0.8548611111111111 | 0 |
| 0.8555555555555556 | 0 |
| 0.8562500000000001 | 0 |
| 0.8569444444444444 | 0 |
| 0.8576388888888888 | 0 |
| 0.8583333333333334 | 0 |
| 0.8590277777777778 | 0 |
| 0.8597222222222222 | 0 |
| 0.8604166666666666 | 0 |
| 0.8611111111111112 | 0 |
| 0.8618055555555556 | 0 |
| 0.8624999999999999 | 0 |
| 0.8631944444444444 | 0 |
| 0.8638888888888889 | 0 |
| 0.8645833333333334 | 0 |
| 0.8652777777777777 | 0 |
| 0.8659722222222223 | 0 |
| 0.8666666666666667 | 0 |
| 0.8673611111111111 | 0 |
| 0.8680555555555555 | 0 |
| 0.86875 | 0 |
| 0.8694444444444445 | 0 |
| 0.8701388888888889 | 0 |
| 0.8708333333333332 | 0 |
| 0.8715277777777778 | 0 |
| 0.8722222222222222 | 0 |
| 0.8729166666666667 | 0 |
| 0.873611111111111 | 0 |
| 0.8743055555555556 | 0 |
| 0.875 | 0 |
| 0.8756944444444444 | 0 |
| 0.876388888888889 | 0 |
| 0.8770833333333333 | 0 |
| 0.8777777777777778 | 0 |
| 0.8784722222222222 | 0 |
| 0.8791666666666668 | 0 |
| 0.8798611111111111 | 0 |
| 0.8805555555555555 | 0 |
| 0.88125 | 0 |
| 0.8819444444444445 | 0 |
| 0.8826388888888889 | 0 |
| 0.8833333333333333 | 0 |
| 0.8840277777777777 | 0 |
| 0.8847222222222223 | 0 |
| 0.8854166666666666 | 0 |
| 0.8861111111111111 | 0 |
| 0.8868055555555556 | 0 |
| 0.8875000000000001 | 0 |
| 0.8881944444444444 | 0 |
| 0.8888888888888888 | 0 |
| 0.8895833333333334 | 0 |
| 0.8902777777777778 | 0 |
| 0.8909722222222222 | 0 |
| 0.8916666666666666 | 0 |
| 0.8923611111111112 | 0 |
| 0.8930555555555556 | 0 |
| 0.8937499999999999 | 0 |
| 0.8944444444444444 | 0 |
| 0.8951388888888889 | 0 |
| 0.8958333333333334 | 0 |
| 0.8965277777777777 | 0 |
| 0.8972222222222223 | 0 |
| 0.8979166666666667 | 0 |
| 0.8986111111111111 | 0 |
| 0.8993055555555555 | 0 |
| 0.9 | 0 |
| 0.9006944444444445 | 0 |
| 0.9013888888888889 | 0 |
| 0.9020833333333332 | 0 |
| 0.9027777777777778 | 0 |
| 0.9034722222222222 | 0 |
| 0.9041666666666667 | 0 |
| 0.904861111111111 | 0 |
| 0.9055555555555556 | 0 |
| 0.90625 | 0 |
| 0.9069444444444444 | 0 |
| 0.907638888888889 | 0 |
| 0.9083333333333333 | 0 |
| 0.9090277777777778 | 0 |
| 0.9097222222222222 | 0 |
| 0.9104166666666668 | 0 |
| 0.9111111111111111 | 0 |
| 0.9118055555555555 | 0 |
| 0.9125 | 0 |
| 0.9131944444444445 | 0 |
| 0.9138888888888889 | 0 |
| 0.9145833333333333 | 0 |
| 0.9152777777777777 | 0 |
| 0.9159722222222223 | 0 |
| 0.9166666666666666 | 0 |
| 0.9173611111111111 | 0 |
| 0.9180555555555556 | 0 |
| 0.9187500000000001 | 0 |
| 0.9194444444444444 | 0 |
| 0.9201388888888888 | 0 |
| 0.9208333333333334 | 0 |
| 0.9215277777777778 | 0 |
| 0.9222222222222222 | 0 |
| 0.9229166666666666 | 0 |
| 0.9236111111111112 | 0 |
| 0.9243055555555556 | 0 |
| 0.9249999999999999 | 0 |
| 0.9256944444444444 | 0 |
| 0.9263888888888889 | 0 |
| 0.9270833333333334 | 0 |
| 0.9277777777777777 | 0 |
| 0.9284722222222223 | 0 |
| 0.9291666666666667 | 0 |
| 0.9298611111111111 | 0 |
| 0.9305555555555555 | 0 |
| 0.93125 | 0 |
| 0.9319444444444445 | 0 |
| 0.9326388888888889 | 0 |
| 0.9333333333333332 | 0 |
| 0.9340277777777778 | 0 |
| 0.9347222222222222 | 0 |
| 0.9354166666666667 | 0 |
| 0.936111111111111 | 0 |
| 0.9368055555555556 | 0 |
| 0.9375 | 0 |
| 0.9381944444444444 | 0 |
| 0.938888888888889 | 0 |
| 0.9395833333333333 | 0 |
| 0.9402777777777778 | 0 |
| 0.9409722222222222 | 0 |
| 0.9416666666666668 | 0 |
| 0.9423611111111111 | 0 |
| 0.9430555555555555 | 0 |
| 0.94375 | 0 |
| 0.9444444444444445 | 0 |
| 0.9451388888888889 | 0 |
| 0.9458333333333333 | 0 |
| 0.9465277777777777 | 0 |
| 0.9472222222222223 | 0 |
| 0.9479166666666666 | 0 |
| 0.9486111111111111 | 0 |
| 0.9493055555555556 | 0 |
| 0.9500000000000001 | 0 |
| 0.9506944444444444 | 0 |
| 0.9513888888888888 | 0 |
| 0.9520833333333334 | 0 |
| 0.9527777777777778 | 0 |
| 0.9534722222222222 | 0 |
| 0.9541666666666666 | 0 |
| 0.9548611111111112 | 0 |
| 0.9555555555555556 | 0 |
| 0.9562499999999999 | 0 |
| 0.9569444444444444 | 0 |
| 0.9576388888888889 | 0 |
| 0.9583333333333334 | 0 |
| 0.9590277777777777 | 0 |
| 0.9597222222222223 | 0 |
| 0.9604166666666667 | 0 |
| 0.9611111111111111 | 0 |
| 0.9618055555555555 | 0 |
| 0.9625 | 0 |
| 0.9631944444444445 | 0 |
| 0.9638888888888889 | 0 |
| 0.9645833333333332 | 0 |
| 0.9652777777777778 | 0 |
| 0.9659722222222222 | 0 |
| 0.9666666666666667 | 0 |
| 0.967361111111111 | 0 |
| 0.9680555555555556 | 0 |
| 0.96875 | 0 |
| 0.9694444444444444 | 0 |
| 0.970138888888889 | 0 |
| 0.9708333333333333 | 0 |
| 0.9715277777777778 | 0 |
| 0.9722222222222222 | 0 |
| 0.9729166666666668 | 0 |
| 0.9736111111111111 | 0 |
| 0.9743055555555555 | 0 |
| 0.975 | 0 |
| 0.9756944444444445 | 0 |
| 0.9763888888888889 | 0 |
| 0.9770833333333333 | 0 |
| 0.9777777777777777 | 0 |
| 0.9784722222222223 | 0 |
| 0.9791666666666666 | 0 |
| 0.9798611111111111 | 0 |
| 0.9805555555555556 | 0 |
| 0.9812500000000001 | 0 |
| 0.9819444444444444 | 0 |
| 0.9826388888888888 | 0 |
| 0.9833333333333334 | 0 |
| 0.9840277777777778 | 0 |
| 0.9847222222222222 | 0 |
| 0.9854166666666666 | 0 |
| 0.9861111111111112 | 0 |
| 0.9868055555555556 | 0 |
| 0.9874999999999999 | 0 |
| 0.9881944444444444 | 0 |
| 0.9888888888888889 | 0 |
| 0.9895833333333334 | 0 |
| 0.9902777777777777 | 0 |
| 0.9909722222222223 | 0 |
| 0.9916666666666667 | 0 |
| 0.9923611111111111 | 0 |
| 0.9930555555555555 | 0 |
| 0.99375 | 0 |
| 0.9944444444444445 | 0 |
| 0.9951388888888889 | 0 |
| 0.9958333333333332 | 0 |
| 0.9965277777777778 | 0 |
| 0.9972222222222222 | 0 |
| 0.9979166666666667 | 0 |
| 0.998611111111111 | 0 |
| 0.9993055555555556 | 0 |